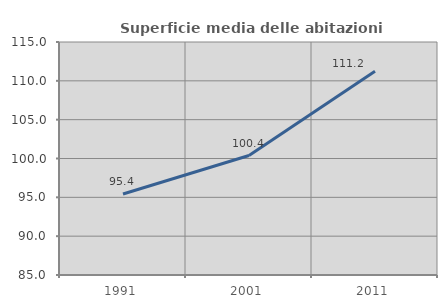
| Category | Superficie media delle abitazioni occupate |
|---|---|
| 1991.0 | 95.434 |
| 2001.0 | 100.38 |
| 2011.0 | 111.225 |